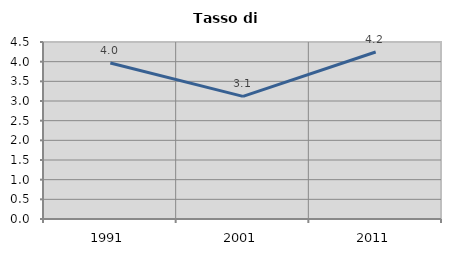
| Category | Tasso di disoccupazione   |
|---|---|
| 1991.0 | 3.965 |
| 2001.0 | 3.118 |
| 2011.0 | 4.247 |